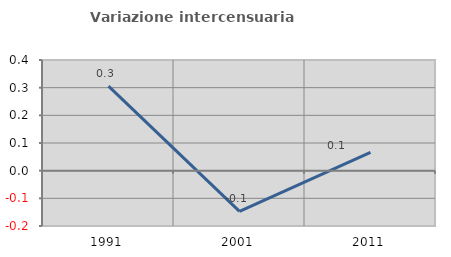
| Category | Variazione intercensuaria annua |
|---|---|
| 1991.0 | 0.306 |
| 2001.0 | -0.147 |
| 2011.0 | 0.066 |